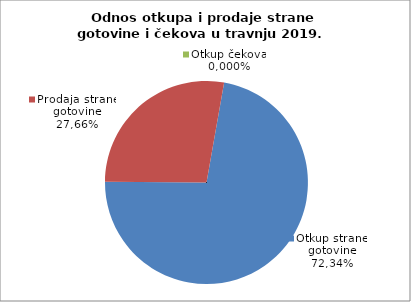
| Category | Otkup strane gotovine |
|---|---|
| 0 | 72.34 |
| 1 | 27.66 |
| 2 | 0 |